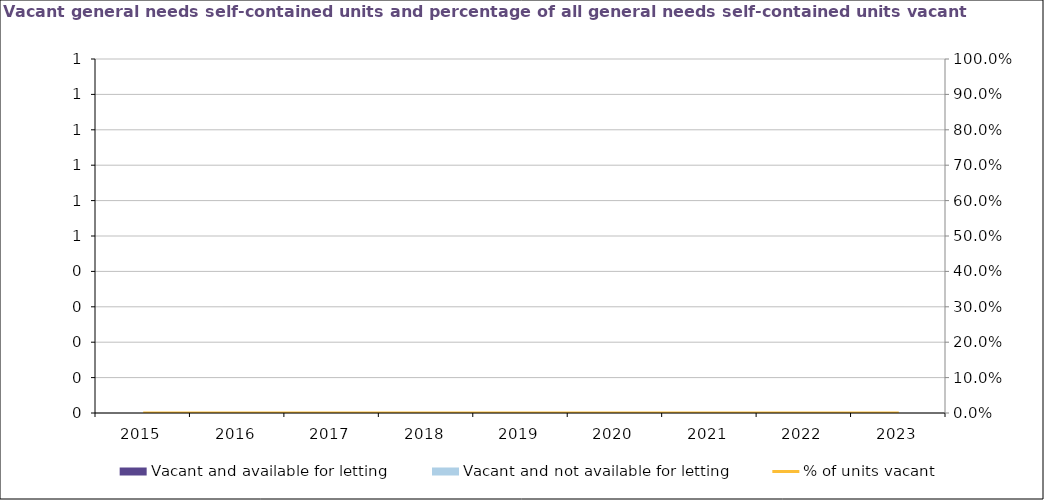
| Category | Vacant and available for letting | Vacant and not available for letting |
|---|---|---|
| 2015.0 | 0 | 0 |
| 2016.0 | 0 | 0 |
| 2017.0 | 0 | 0 |
| 2018.0 | 0 | 0 |
| 2019.0 | 0 | 0 |
| 2020.0 | 0 | 0 |
| 2021.0 | 0 | 0 |
| 2022.0 | 0 | 0 |
| 2023.0 | 0 | 0 |